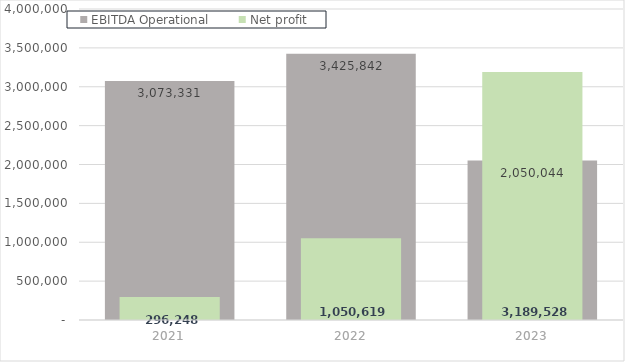
| Category | EBITDA Operational |
|---|---|
| 2021.0 | 3073331.48 |
| 2022.0 | 3425841.84 |
| 2023.0 | 2050043.95 |